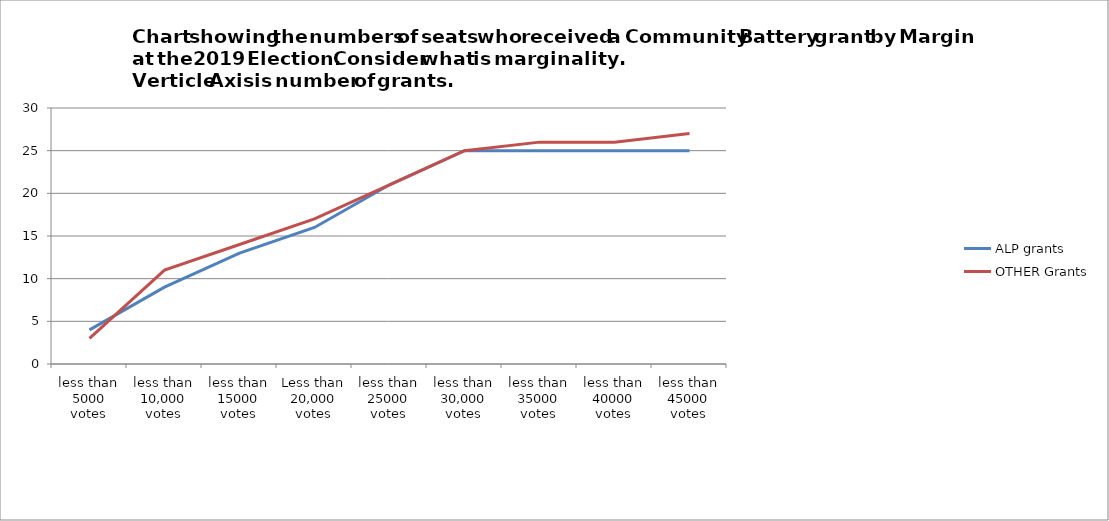
| Category | ALP grants | OTHER Grants |
|---|---|---|
| less than 5000 votes | 4 | 3 |
| less than 10,000 votes | 9 | 11 |
| less than 15000 votes | 13 | 14 |
| Less than 20,000 votes | 16 | 17 |
| less than 25000 votes | 21 | 21 |
| less than 30,000 votes | 25 | 25 |
| less than 35000 votes | 25 | 26 |
| less than 40000 votes | 25 | 26 |
| less than 45000 votes | 25 | 27 |